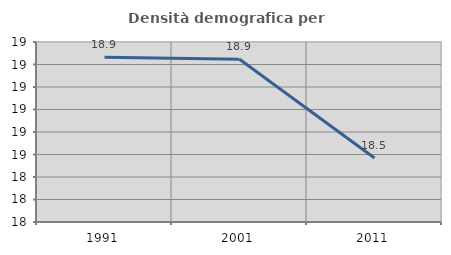
| Category | Densità demografica |
|---|---|
| 1991.0 | 18.932 |
| 2001.0 | 18.924 |
| 2011.0 | 18.484 |